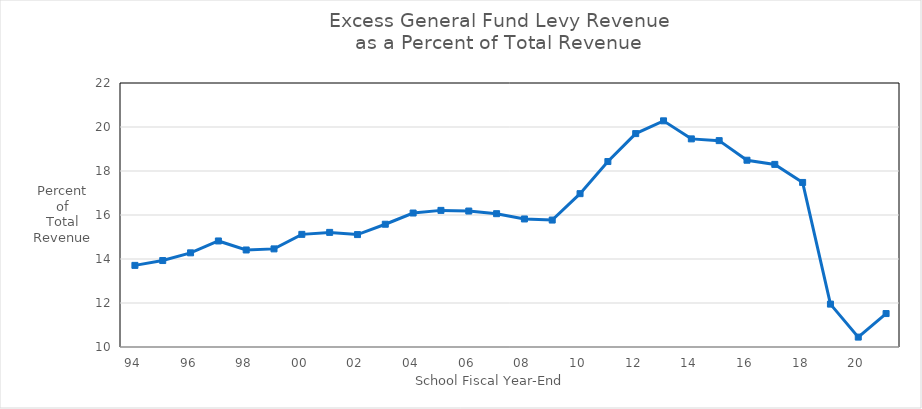
| Category | Percent |
|---|---|
| 94 | 13.71 |
| 95 | 13.93 |
| 96 | 14.28 |
| 97 | 14.82 |
| 98 | 14.41 |
| 99 | 14.46 |
| 00 | 15.12 |
| 01 | 15.21 |
| 02 | 15.11 |
| 03 | 15.58 |
| 04 | 16.09 |
| 05 | 16.21 |
| 06 | 16.18 |
| 07 | 16.06 |
| 08 | 15.82 |
| 09 | 15.77 |
| 10 | 16.97 |
| 11 | 18.43 |
| 12 | 19.7 |
| 13 | 20.28 |
| 14 | 19.46 |
| 15 | 19.38 |
| 16 | 18.49 |
| 17 | 18.3 |
| 18 | 17.48 |
| 19 | 11.95 |
| 20 | 10.45 |
| 21 | 11.52 |